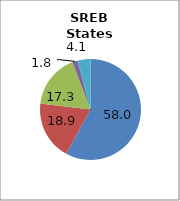
| Category | 50 states and D.C.2 |
|---|---|
| White | 57.981 |
| Black | 18.885 |
| Hispanic | 17.298 |
| Two or More Races | 1.781 |
| All Other1 | 4.055 |